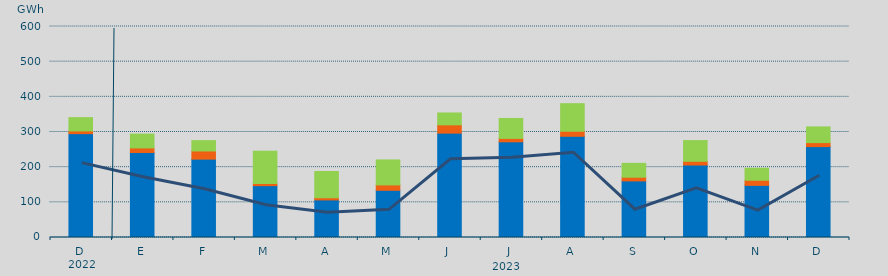
| Category | Asignación SEPE | Asignación Francia | Asignación Portugal |
|---|---|---|---|
| D | 295334.825 | 7715.1 | 37807.2 |
| E | 241649.025 | 13030.5 | 39359.9 |
| F | 222841.2 | 23234.4 | 29375.8 |
| M | 147441.275 | 6126.3 | 91808.3 |
| A | 106835.5 | 6210.9 | 74632.6 |
| M | 134157.925 | 15418.6 | 70990 |
| J | 296773.85 | 23610.9 | 33804.6 |
| J | 272106 | 9754 | 56632.6 |
| A | 287813.1 | 14419.4 | 78281 |
| S | 160873.1 | 10544 | 39388.9 |
| O | 206141.775 | 10508.8 | 58942.5 |
| N | 148282.275 | 14554.1 | 34048.3 |
| D | 258424.925 | 11374.3 | 44685.4 |